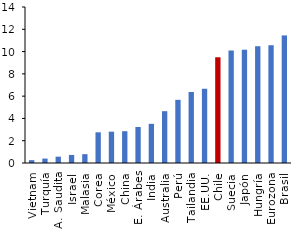
| Category | Series 0 |
|---|---|
| Vietnam | 0.254 |
| Turquía | 0.396 |
| A. Saudita | 0.568 |
| Israel | 0.723 |
| Malasia | 0.793 |
| Corea | 2.754 |
| México | 2.812 |
| China | 2.852 |
| E. Árabes | 3.233 |
| India | 3.515 |
| Australia | 4.651 |
| Perú | 5.669 |
| Tailandia | 6.371 |
| EE.UU. | 6.663 |
| Chile | 9.488 |
| Suecia | 10.096 |
| Japón | 10.166 |
| Hungría | 10.481 |
| Eurozona | 10.569 |
| Brasil | 11.45 |